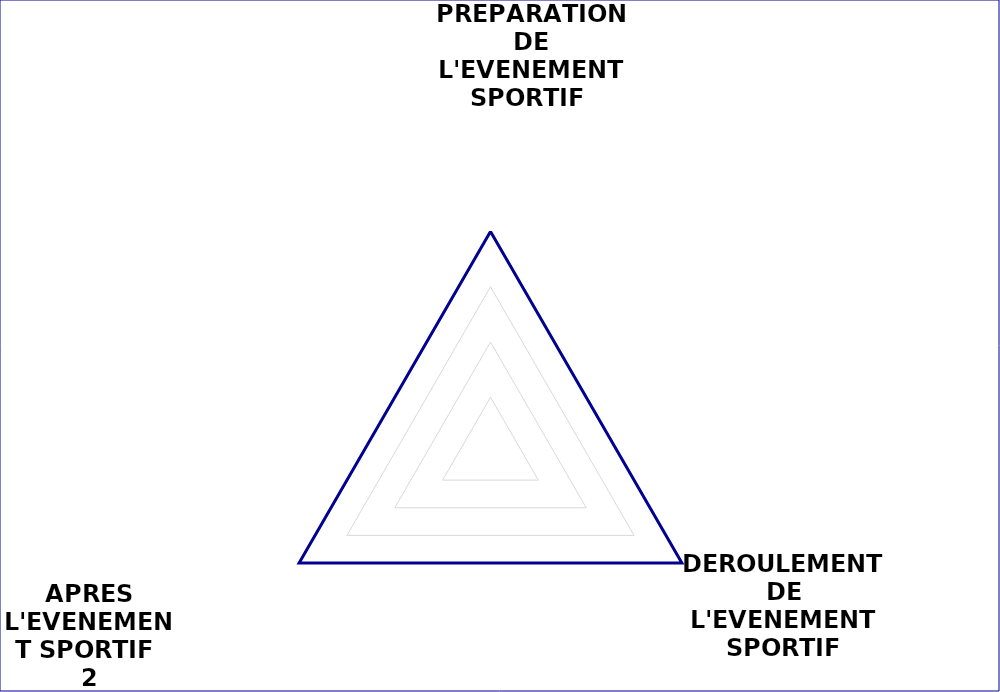
| Category | Series 0 |
|---|---|
| PREPARATION DE L'EVENEMENT SPORTIF  | 2 |
| DEROULEMENT DE L'EVENEMENT SPORTIF | 2 |
| APRES L'EVENEMENT SPORTIF  | 2 |